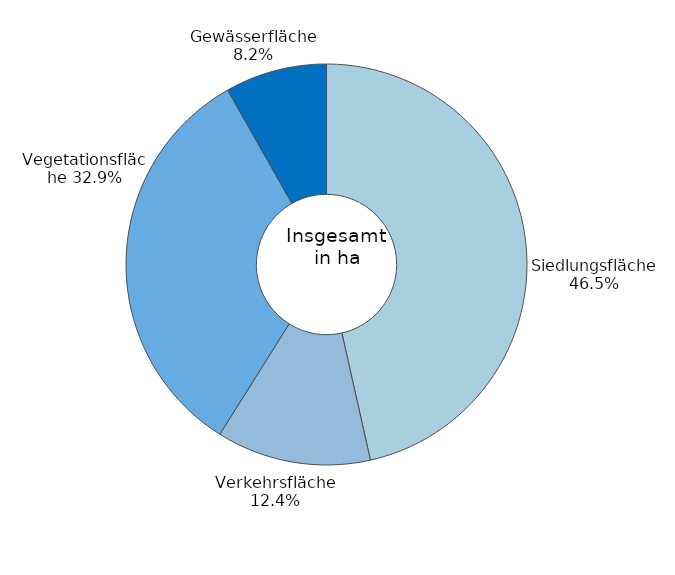
| Category | Series 0 |
|---|---|
| Siedlungsfläche | 0.465 |
| Verkehrsfläche | 0.124 |
| Vegetationsfläche | 0.329 |
| Gewässerfläche | 0.082 |